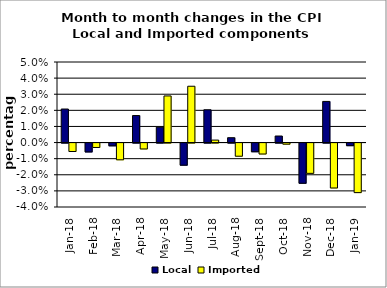
| Category | Local | Imported |
|---|---|---|
| 2018-01-01 | 0.021 | -0.005 |
| 2018-02-01 | -0.006 | -0.003 |
| 2018-03-01 | -0.002 | -0.01 |
| 2018-04-01 | 0.017 | -0.004 |
| 2018-05-01 | 0.01 | 0.029 |
| 2018-06-01 | -0.014 | 0.035 |
| 2018-07-01 | 0.02 | 0.002 |
| 2018-08-01 | 0.003 | -0.008 |
| 2018-09-01 | -0.005 | -0.007 |
| 2018-10-01 | 0.004 | -0.001 |
| 2018-11-01 | -0.025 | -0.019 |
| 2018-12-01 | 0.026 | -0.028 |
| 2019-01-01 | -0.002 | -0.031 |